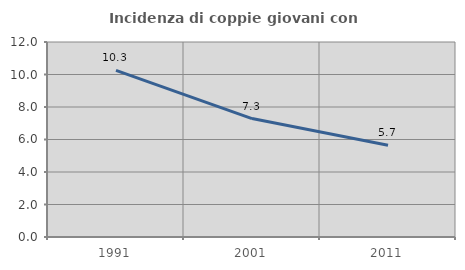
| Category | Incidenza di coppie giovani con figli |
|---|---|
| 1991.0 | 10.256 |
| 2001.0 | 7.29 |
| 2011.0 | 5.651 |